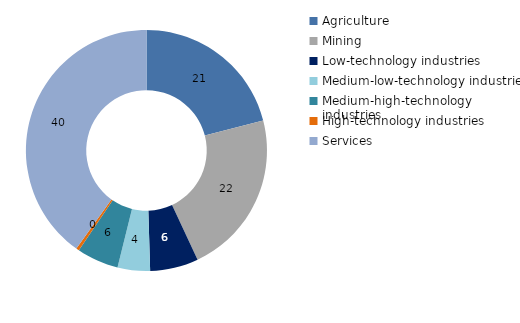
| Category | 1995 |
|---|---|
| Agriculture | 20.983 |
| Mining | 22.051 |
| Low-technology industries | 6.482 |
| Medium-low-technology industries | 4.357 |
| Medium-high-technology industries | 5.613 |
| High-technology industries | 0.402 |
| Services | 40.113 |